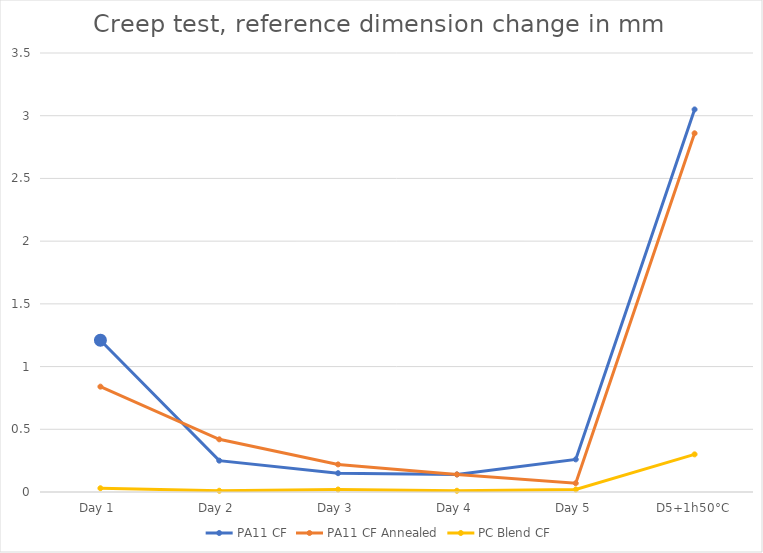
| Category | PA11 CF | PA11 CF Annealed | PC Blend CF |
|---|---|---|---|
| Day 1 | 1.21 | 0.84 | 0.03 |
| Day 2 | 0.25 | 0.42 | 0.01 |
| Day 3 | 0.15 | 0.22 | 0.02 |
| Day 4 | 0.14 | 0.14 | 0.01 |
| Day 5 | 0.26 | 0.07 | 0.02 |
| D5+1h50°C | 3.05 | 2.86 | 0.3 |